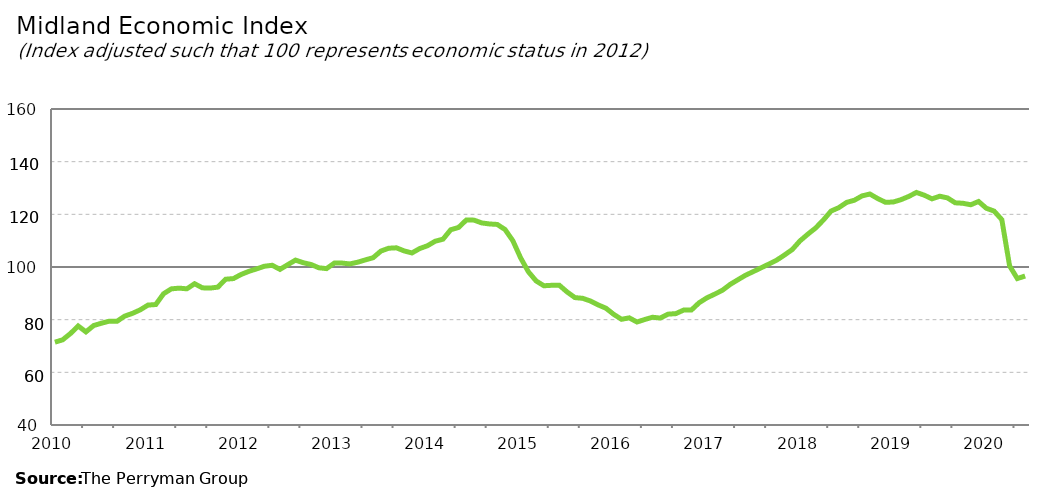
| Category | Midland Composite |
|---|---|
| 2010-01-31 | 71.45 |
| 2010-02-28 | 72.346 |
| 2010-03-31 | 74.711 |
| 2010-04-30 | 77.596 |
| 2010-05-31 | 75.369 |
| 2010-06-30 | 77.779 |
| 2010-07-31 | 78.65 |
| 2010-08-31 | 79.425 |
| 2010-09-30 | 79.371 |
| 2010-10-31 | 81.355 |
| 2010-11-30 | 82.399 |
| 2010-12-31 | 83.74 |
| 2011-01-31 | 85.541 |
| 2011-02-28 | 85.747 |
| 2011-03-31 | 89.838 |
| 2011-04-30 | 91.695 |
| 2011-05-31 | 91.971 |
| 2011-06-30 | 91.717 |
| 2011-07-31 | 93.647 |
| 2011-08-31 | 92.088 |
| 2011-09-30 | 91.991 |
| 2011-10-31 | 92.359 |
| 2011-11-30 | 95.355 |
| 2011-12-31 | 95.6 |
| 2012-01-31 | 97.18 |
| 2012-02-29 | 98.35 |
| 2012-03-31 | 99.303 |
| 2012-04-30 | 100.291 |
| 2012-05-31 | 100.652 |
| 2012-06-30 | 99.101 |
| 2012-07-31 | 100.878 |
| 2012-08-31 | 102.609 |
| 2012-09-30 | 101.627 |
| 2012-10-31 | 100.953 |
| 2012-11-30 | 99.705 |
| 2012-12-31 | 99.389 |
| 2013-01-31 | 101.472 |
| 2013-02-28 | 101.493 |
| 2013-03-31 | 101.171 |
| 2013-04-30 | 101.81 |
| 2013-05-31 | 102.699 |
| 2013-06-30 | 103.523 |
| 2013-07-31 | 106.042 |
| 2013-08-31 | 107.125 |
| 2013-09-30 | 107.282 |
| 2013-10-31 | 106.108 |
| 2013-11-30 | 105.337 |
| 2013-12-31 | 107 |
| 2014-01-31 | 108.073 |
| 2014-02-28 | 109.79 |
| 2014-03-31 | 110.559 |
| 2014-04-30 | 114.149 |
| 2014-05-31 | 115.006 |
| 2014-06-30 | 117.82 |
| 2014-07-31 | 117.798 |
| 2014-08-31 | 116.731 |
| 2014-09-30 | 116.345 |
| 2014-10-31 | 116.16 |
| 2014-11-30 | 114.212 |
| 2014-12-31 | 109.992 |
| 2015-01-31 | 103.485 |
| 2015-02-28 | 98.206 |
| 2015-03-31 | 94.706 |
| 2015-04-30 | 92.878 |
| 2015-05-31 | 93.045 |
| 2015-06-30 | 93.041 |
| 2015-07-31 | 90.493 |
| 2015-08-31 | 88.383 |
| 2015-09-30 | 88.106 |
| 2015-10-31 | 87.079 |
| 2015-11-30 | 85.6 |
| 2015-12-31 | 84.34 |
| 2016-01-31 | 82.013 |
| 2016-02-29 | 80.144 |
| 2016-03-31 | 80.687 |
| 2016-04-30 | 79.108 |
| 2016-05-31 | 80.071 |
| 2016-06-30 | 80.914 |
| 2016-07-31 | 80.604 |
| 2016-08-31 | 82.092 |
| 2016-09-30 | 82.294 |
| 2016-10-31 | 83.633 |
| 2016-11-30 | 83.647 |
| 2016-12-31 | 86.422 |
| 2017-01-31 | 88.288 |
| 2017-02-28 | 89.678 |
| 2017-03-31 | 91.163 |
| 2017-04-30 | 93.389 |
| 2017-05-31 | 95.164 |
| 2017-06-30 | 96.9 |
| 2017-07-31 | 98.289 |
| 2017-08-31 | 99.711 |
| 2017-09-30 | 101.128 |
| 2017-10-31 | 102.611 |
| 2017-11-30 | 104.56 |
| 2017-12-31 | 106.632 |
| 2018-01-31 | 109.927 |
| 2018-02-28 | 112.441 |
| 2018-03-31 | 114.791 |
| 2018-04-30 | 117.802 |
| 2018-05-31 | 121.244 |
| 2018-06-30 | 122.541 |
| 2018-07-31 | 124.531 |
| 2018-08-31 | 125.353 |
| 2018-09-30 | 127.013 |
| 2018-10-31 | 127.715 |
| 2018-11-30 | 126.005 |
| 2018-12-31 | 124.584 |
| 2019-01-31 | 124.665 |
| 2019-02-28 | 125.553 |
| 2019-03-31 | 126.786 |
| 2019-04-30 | 128.308 |
| 2019-05-31 | 127.283 |
| 2019-06-30 | 125.878 |
| 2019-07-31 | 126.881 |
| 2019-08-31 | 126.232 |
| 2019-09-30 | 124.374 |
| 2019-10-31 | 124.192 |
| 2019-11-30 | 123.633 |
| 2019-12-31 | 124.874 |
| 2020-01-31 | 122.311 |
| 2020-02-29 | 121.234 |
| 2020-03-31 | 117.967 |
| 2020-04-30 | 100.429 |
| 2020-05-31 | 95.605 |
| 2020-06-30 | 96.578 |